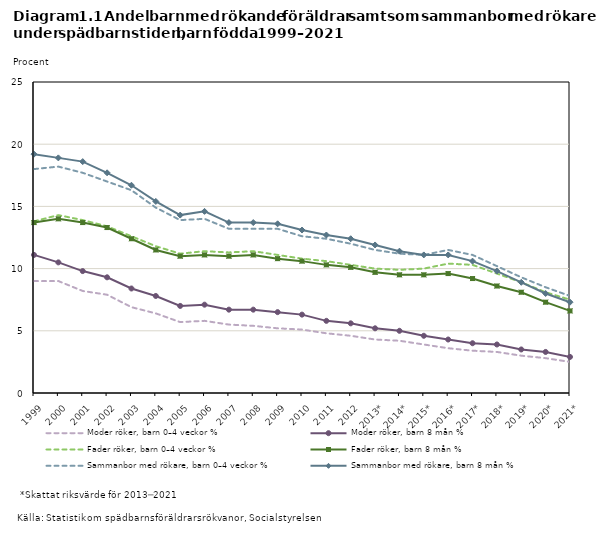
| Category | Moder röker, barn 0–4 veckor % | Moder röker, barn 8 mån % | Fader röker, barn 0–4 veckor % | Fader röker, barn 8 mån % | Sammanbor med rökare, barn 0–4 veckor % | Sammanbor med rökare, barn 8 mån % |
|---|---|---|---|---|---|---|
| 1999 | 9 | 11.1 | 13.8 | 13.7 | 18 | 19.2 |
| 2000 | 9 | 10.5 | 14.3 | 14 | 18.2 | 18.9 |
| 2001 | 8.2 | 9.8 | 13.9 | 13.7 | 17.7 | 18.6 |
| 2002 | 7.9 | 9.3 | 13.4 | 13.3 | 17 | 17.7 |
| 2003 | 6.9 | 8.4 | 12.6 | 12.4 | 16.3 | 16.7 |
| 2004 | 6.4 | 7.8 | 11.8 | 11.5 | 14.9 | 15.4 |
| 2005 | 5.7 | 7 | 11.2 | 11 | 13.9 | 14.3 |
| 2006 | 5.8 | 7.1 | 11.4 | 11.1 | 14 | 14.6 |
| 2007 | 5.5 | 6.7 | 11.3 | 11 | 13.2 | 13.7 |
| 2008 | 5.4 | 6.7 | 11.4 | 11.1 | 13.2 | 13.7 |
| 2009 | 5.2 | 6.5 | 11.1 | 10.8 | 13.2 | 13.6 |
| 2010 | 5.1 | 6.3 | 10.8 | 10.6 | 12.6 | 13.1 |
| 2011 | 4.8 | 5.8 | 10.6 | 10.3 | 12.4 | 12.7 |
| 2012 | 4.6 | 5.6 | 10.3 | 10.1 | 12 | 12.4 |
| 2013* | 4.3 | 5.2 | 10 | 9.7 | 11.5 | 11.9 |
| 2014* | 4.2 | 5 | 9.9 | 9.5 | 11.2 | 11.4 |
| 2015* | 3.9 | 4.6 | 10 | 9.5 | 11.1 | 11.1 |
| 2016* | 3.6 | 4.3 | 10.4 | 9.6 | 11.5 | 11.1 |
| 2017* | 3.4 | 4 | 10.3 | 9.2 | 11.1 | 10.6 |
| 2018* | 3.3 | 3.9 | 9.6 | 8.6 | 10.2 | 9.8 |
| 2019* | 3 | 3.5 | 8.9 | 8.1 | 9.3 | 8.9 |
| 2020* | 2.8 | 3.3 | 8.1 | 7.3 | 8.5 | 8 |
| 2021* | 2.5 | 2.9 | 7.5 | 6.6 | 7.8 | 7.3 |